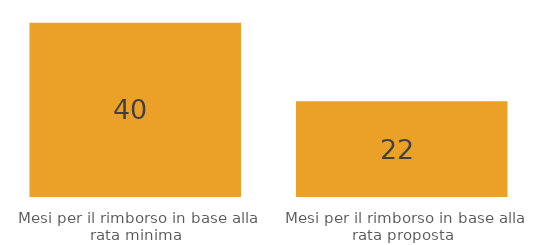
| Category | Series 0 |
|---|---|
| Mesi per il rimborso in base alla rata minima | 40 |
| Mesi per il rimborso in base alla rata proposta | 22 |